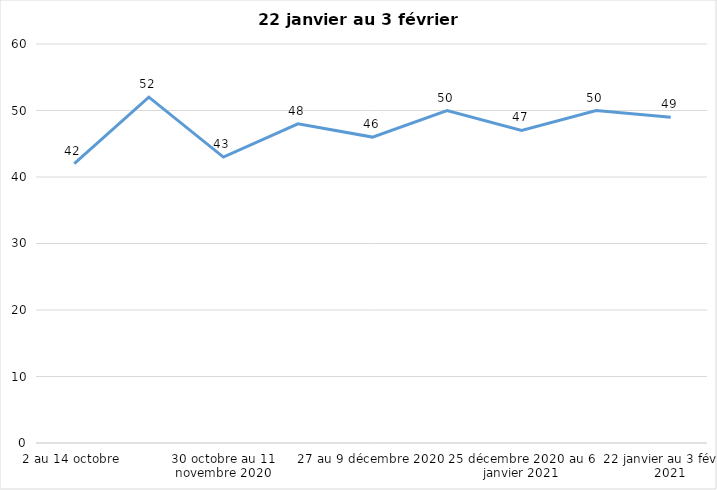
| Category | Toujours aux trois mesures |
|---|---|
| 2 au 14 octobre  | 42 |
| 16 au 28 octobre 2020 | 52 |
| 30 octobre au 11 novembre 2020 | 43 |
| 13 au 25 novembre 2020 | 48 |
| 27 au 9 décembre 2020 | 46 |
| 11 au 25 décembre 2020 | 50 |
| 25 décembre 2020 au 6 janvier 2021 | 47 |
| 8 au 20 janvier 2021 | 50 |
| 22 janvier au 3 février 2021 | 49 |